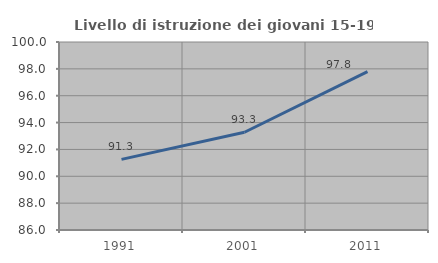
| Category | Livello di istruzione dei giovani 15-19 anni |
|---|---|
| 1991.0 | 91.258 |
| 2001.0 | 93.28 |
| 2011.0 | 97.792 |